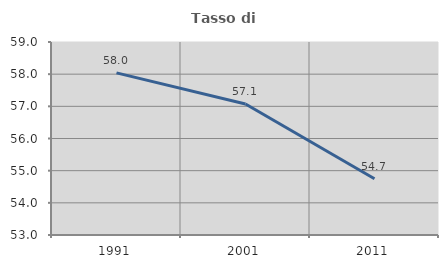
| Category | Tasso di occupazione   |
|---|---|
| 1991.0 | 58.039 |
| 2001.0 | 57.074 |
| 2011.0 | 54.749 |